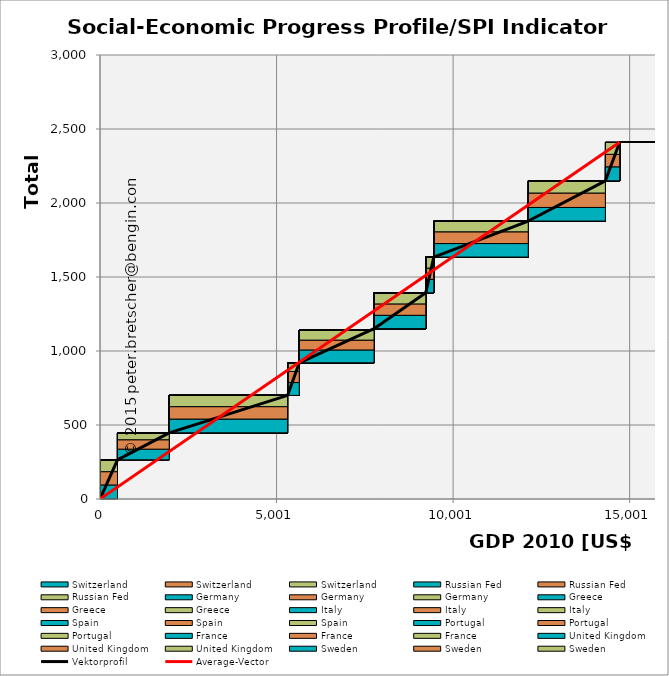
| Category | transparent | Switzerland | Russian Fed | Germany | Greece | Italy | Spain | Portugal | France | United Kingdom | Sweden | Border right & top |
|---|---|---|---|---|---|---|---|---|---|---|---|---|
| 0.0 | 0 | 79.92 | 0 | 0 | 0 | 0 | 0 | 0 | 0 | 0 | 0 | 0 |
| 494.6 | 0 | 79.92 | 0 | 0 | 0 | 0 | 0 | 0 | 0 | 0 | 0 | 0 |
| 494.6 | 264.57 | 0 | 46.58 | 0 | 0 | 0 | 0 | 0 | 0 | 0 | 0 | 0 |
| 1959.6999999999998 | 264.57 | 0 | 46.58 | 0 | 0 | 0 | 0 | 0 | 0 | 0 | 0 | 0 |
| 1959.6999999999998 | 446.96 | 0 | 0 | 75.81 | 0 | 0 | 0 | 0 | 0 | 0 | 0 | 0 |
| 5312.4 | 446.96 | 0 | 0 | 75.81 | 0 | 0 | 0 | 0 | 0 | 0 | 0 | 0 |
| 5312.4 | 699.91 | 0 | 0 | 0 | 58.45 | 0 | 0 | 0 | 0 | 0 | 0 | 0 |
| 5643.2 | 699.91 | 0 | 0 | 0 | 58.45 | 0 | 0 | 0 | 0 | 0 | 0 | 0 |
| 5643.2 | 920.2 | 0 | 0 | 0 | 0 | 66.58 | 0 | 0 | 0 | 0 | 0 | 0 |
| 7761.5 | 920.2 | 0 | 0 | 0 | 0 | 66.58 | 0 | 0 | 0 | 0 | 0 | 0 |
| 7761.5 | 1150.99 | 0 | 0 | 0 | 0 | 0 | 75.19 | 0 | 0 | 0 | 0 | 0 |
| 9225.5 | 1150.99 | 0 | 0 | 0 | 0 | 0 | 75.19 | 0 | 0 | 0 | 0 | 0 |
| 9225.5 | 1393.3 | 0 | 0 | 0 | 0 | 0 | 0 | 76.11 | 0 | 0 | 0 | 0 |
| 9453.4 | 1393.3 | 0 | 0 | 0 | 0 | 0 | 0 | 76.11 | 0 | 0 | 0 | 0 |
| 9453.4 | 1634.77 | 0 | 0 | 0 | 0 | 0 | 0 | 0 | 72.72 | 0 | 0 | 0 |
| 12129.3 | 1634.77 | 0 | 0 | 0 | 0 | 0 | 0 | 0 | 72.72 | 0 | 0 | 0 |
| 12129.3 | 1878.09 | 0 | 0 | 0 | 0 | 0 | 0 | 0 | 0 | 82.29 | 0 | 0 |
| 14312.9 | 1878.09 | 0 | 0 | 0 | 0 | 0 | 0 | 0 | 0 | 82.29 | 0 | 0 |
| 14312.9 | 2149.75 | 0 | 0 | 0 | 0 | 0 | 0 | 0 | 0 | 0 | 81.95 | 0 |
| 14718.3 | 2149.75 | 0 | 0 | 0 | 0 | 0 | 0 | 0 | 0 | 0 | 81.95 | 0 |
| 14718.3 | 2411 | 0 | 0 | 0 | 0 | 0 | 0 | 0 | 0 | 0 | 0 | 0 |
| 15718.3 | 2411 | 0 | 0 | 0 | 0 | 0 | 0 | 0 | 0 | 0 | 0 | 0 |
| 15718.3 | 2411 | 0 | 0 | 0 | 0 | 0 | 0 | 0 | 0 | 0 | 0 | 0 |